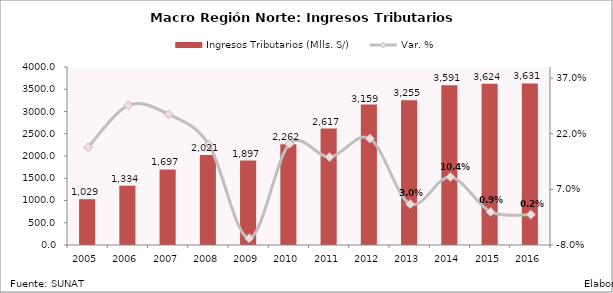
| Category | Ingresos Tributarios (Mlls. S/) |
|---|---|
| 2005.0 | 1028.999 |
| 2006.0 | 1334.236 |
| 2007.0 | 1697.333 |
| 2008.0 | 2021.228 |
| 2009.0 | 1896.767 |
| 2010.0 | 2261.681 |
| 2011.0 | 2616.906 |
| 2012.0 | 3158.562 |
| 2013.0 | 3254.554 |
| 2014.0 | 3591.408 |
| 2015.0 | 3624.451 |
| 2016.0 | 3631.247 |